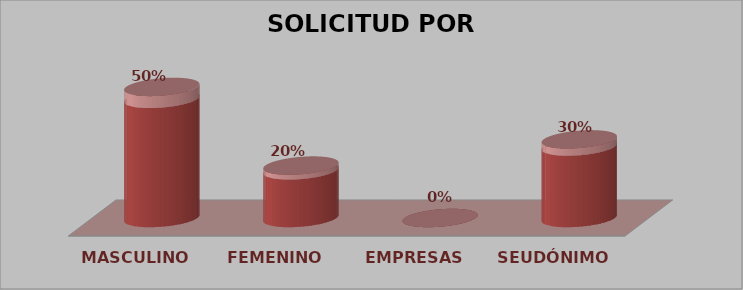
| Category | SOLICITUD POR GÉNERO | Series 1 |
|---|---|---|
| MASCULINO | 5 | 0.5 |
| FEMENINO | 2 | 0.2 |
| EMPRESAS | 0 | 0 |
| SEUDÓNIMO | 3 | 0.3 |